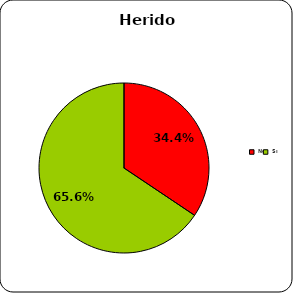
| Category | Herido grave |
|---|---|
| No | 34.4 |
| Si | 65.6 |